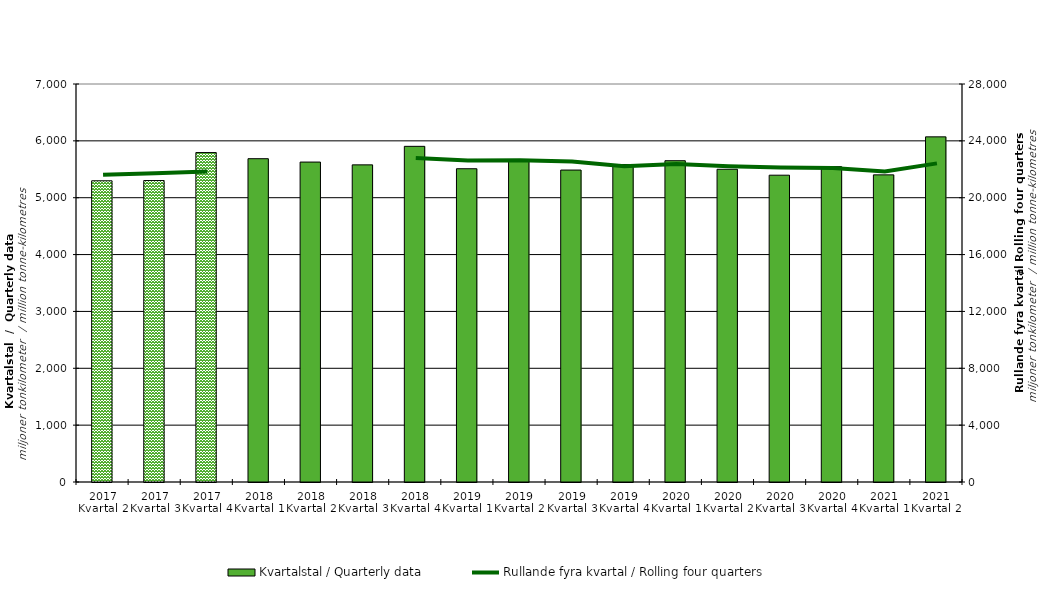
| Category | Kvartalstal / Quarterly data |
|---|---|
| 2017 Kvartal 2 | 5297.279 |
| 2017 Kvartal 3 | 5301.875 |
| 2017 Kvartal 4 | 5794.168 |
| 2018 Kvartal 1 | 5686.345 |
| 2018 Kvartal 2 | 5626.784 |
| 2018 Kvartal 3 | 5577.634 |
| 2018 Kvartal 4 | 5903.543 |
| 2019 Kvartal 1 | 5509.773 |
| 2019 Kvartal 2 | 5641.612 |
| 2019 Kvartal 3 | 5486.395 |
| 2019 Kvartal 4 | 5584.286 |
| 2020 Kvartal 1 | 5650.915 |
| 2020 Kvartal 2 | 5500.334 |
| 2020 Kvartal 3 | 5395.987 |
| 2020 Kvartal 4 | 5546.662 |
| 2021 Kvartal 1 | 5401.907 |
| 2021 Kvartal 2 | 6070.369 |